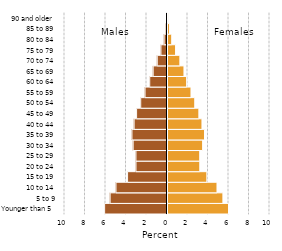
| Category | Female |
|---|---|
| Younger than 5 | 5.954 |
| 5 to 9 | 5.405 |
| 10 to 14 | 4.829 |
| 15 to 19 | 3.839 |
| 20 to 24 | 3.151 |
| 25 to 29 | 3.143 |
| 30 to 34 | 3.427 |
| 35 to 39 | 3.613 |
| 40 to 44 | 3.362 |
| 45 to 49 | 3.06 |
| 50 to 54 | 2.659 |
| 55 to 59 | 2.291 |
| 60 to 64 | 1.867 |
| 65 to 69 | 1.606 |
| 70 to 74 | 1.207 |
| 75 to 79 | 0.787 |
| 80 to 84 | 0.411 |
| 85 to 89 | 0.2 |
| 90 and older | 0.067 |